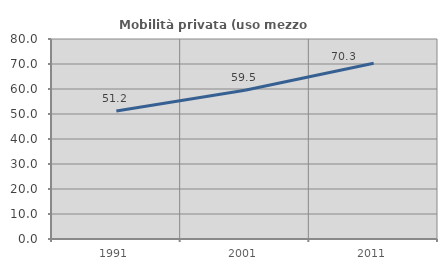
| Category | Mobilità privata (uso mezzo privato) |
|---|---|
| 1991.0 | 51.231 |
| 2001.0 | 59.472 |
| 2011.0 | 70.291 |